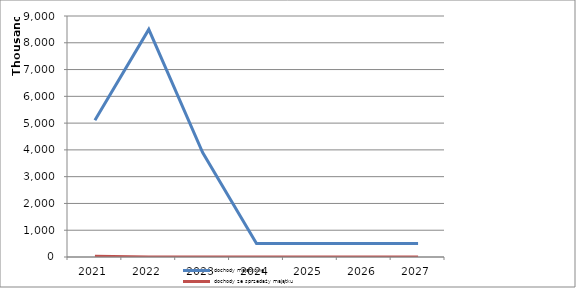
| Category | dochody majątkowe | dochody ze sprzedaży majątku |
|---|---|---|
| 2021.0 | 5103624 | 29000 |
| 2022.0 | 8500000 | 0 |
| 2023.0 | 3900000 | 0 |
| 2024.0 | 500000 | 0 |
| 2025.0 | 500000 | 0 |
| 2026.0 | 500000 | 0 |
| 2027.0 | 500000 | 0 |